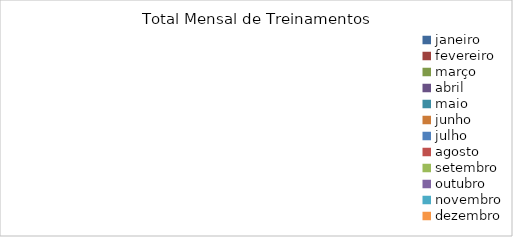
| Category | Total Mensal de Treinamentos |
|---|---|
| janeiro | 0 |
| fevereiro | 0 |
| março | 0 |
| abril | 0 |
| maio | 0 |
| junho | 0 |
| julho | 0 |
| agosto | 0 |
| setembro | 0 |
| outubro | 0 |
| novembro | 0 |
| dezembro | 0 |